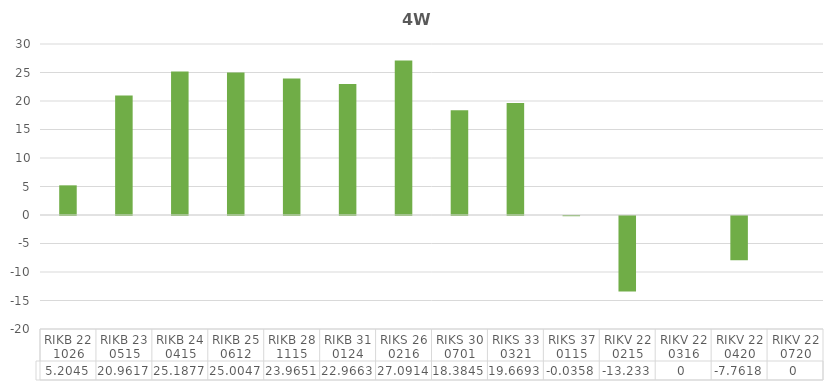
| Category | Series 0 |
|---|---|
| RIKB 22 1026 | 5.204 |
| RIKB 23 0515 | 20.962 |
| RIKB 24 0415 | 25.188 |
| RIKB 25 0612 | 25.005 |
| RIKB 28 1115 | 23.965 |
| RIKB 31 0124 | 22.966 |
| RIKS 26 0216 | 27.091 |
| RIKS 30 0701 | 18.384 |
| RIKS 33 0321 | 19.669 |
| RIKS 37 0115 | -0.036 |
| RIKV 22 0215 | -13.233 |
| RIKV 22 0316 | 0 |
| RIKV 22 0420 | -7.762 |
| RIKV 22 0720 | 0 |